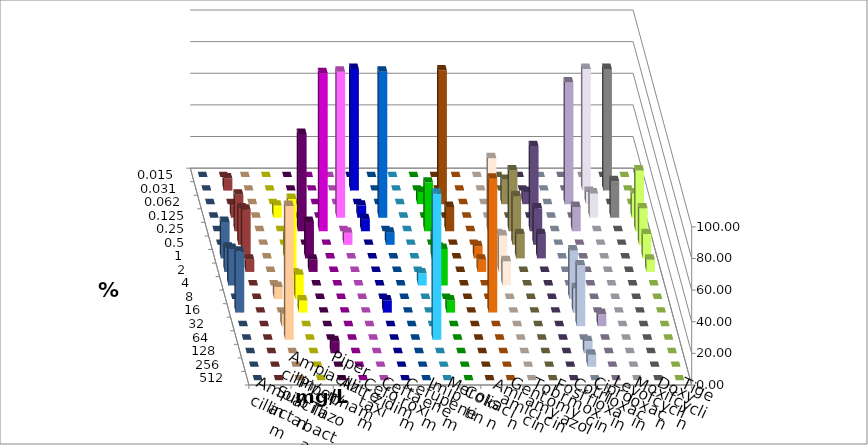
| Category | Ampicillin | Ampicillin/ Sulbactam | Piperacillin | Piperacillin/ Tazobactam | Aztreonam | Cefotaxim | Ceftazidim | Cefuroxim | Imipenem | Meropenem | Colistin | Amikacin | Gentamicin | Tobramycin | Fosfomycin | Cotrimoxazol | Ciprofloxacin | Levofloxacin | Moxifloxacin | Doxycyclin | Tigecyclin |
|---|---|---|---|---|---|---|---|---|---|---|---|---|---|---|---|---|---|---|---|---|---|
| 0.015 | 0 | 0 | 0 | 0 | 0 | 0 | 0 | 0 | 0 | 0 | 0 | 0 | 0 | 0 | 0 | 0 | 0 | 0 | 0 | 0 | 0 |
| 0.031 | 0 | 0 | 0 | 0 | 0 | 76.923 | 0 | 0 | 0 | 0 | 0 | 0 | 0 | 0 | 0 | 0 | 76.923 | 76.923 | 0 | 0 | 7.692 |
| 0.062 | 0 | 0 | 0 | 0 | 0 | 0 | 0 | 0 | 7.692 | 84.615 | 0 | 0 | 15.385 | 7.692 | 0 | 76.923 | 7.692 | 0 | 0 | 0 | 0 |
| 0.125 | 0 | 7.692 | 0 | 0 | 92.308 | 7.692 | 92.308 | 0 | 0 | 0 | 0 | 0 | 0 | 0 | 0 | 0 | 15.385 | 23.077 | 15.385 | 0 | 7.692 |
| 0.25 | 0 | 0 | 61.538 | 100 | 0 | 7.692 | 0 | 0 | 30.769 | 15.385 | 0 | 46.154 | 38.462 | 53.846 | 0 | 15.385 | 0 | 0 | 38.462 | 0 | 23.077 |
| 0.5 | 0 | 0 | 0 | 0 | 7.692 | 0 | 7.692 | 0 | 0 | 0 | 0 | 0 | 30.769 | 23.077 | 0 | 0 | 0 | 0 | 23.077 | 0 | 23.077 |
| 1.0 | 0 | 15.385 | 23.077 | 0 | 0 | 0 | 0 | 0 | 15.385 | 0 | 7.692 | 15.385 | 15.385 | 15.385 | 0 | 0 | 0 | 0 | 15.385 | 23.077 | 30.769 |
| 2.0 | 0 | 46.154 | 7.692 | 0 | 0 | 0 | 0 | 0 | 15.385 | 0 | 7.692 | 23.077 | 0 | 0 | 0 | 0 | 0 | 0 | 7.692 | 15.385 | 7.692 |
| 4.0 | 0 | 7.692 | 0 | 0 | 0 | 0 | 0 | 7.692 | 23.077 | 0 | 0 | 15.385 | 0 | 0 | 0 | 0 | 0 | 0 | 0 | 23.077 | 0 |
| 8.0 | 7.692 | 15.385 | 0 | 0 | 0 | 0 | 0 | 0 | 0 | 0 | 0 | 0 | 0 | 0 | 30.769 | 0 | 0 | 0 | 0 | 0 | 0 |
| 16.0 | 0 | 7.692 | 0 | 0 | 0 | 7.692 | 0 | 0 | 7.692 | 0 | 84.615 | 0 | 0 | 0 | 15.385 | 0 | 0 | 0 | 0 | 38.462 | 0 |
| 32.0 | 7.692 | 0 | 0 | 0 | 0 | 0 | 0 | 0 | 0 | 0 | 0 | 0 | 0 | 0 | 38.462 | 7.692 | 0 | 0 | 0 | 0 | 0 |
| 64.0 | 84.615 | 0 | 0 | 0 | 0 | 0 | 0 | 92.308 | 0 | 0 | 0 | 0 | 0 | 0 | 0 | 0 | 0 | 0 | 0 | 0 | 0 |
| 128.0 | 0 | 0 | 7.692 | 0 | 0 | 0 | 0 | 0 | 0 | 0 | 0 | 0 | 0 | 0 | 7.692 | 0 | 0 | 0 | 0 | 0 | 0 |
| 256.0 | 0 | 0 | 0 | 0 | 0 | 0 | 0 | 0 | 0 | 0 | 0 | 0 | 0 | 0 | 7.692 | 0 | 0 | 0 | 0 | 0 | 0 |
| 512.0 | 0 | 0 | 0 | 0 | 0 | 0 | 0 | 0 | 0 | 0 | 0 | 0 | 0 | 0 | 0 | 0 | 0 | 0 | 0 | 0 | 0 |